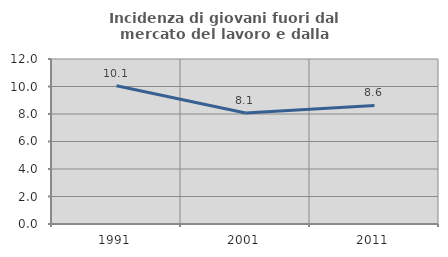
| Category | Incidenza di giovani fuori dal mercato del lavoro e dalla formazione  |
|---|---|
| 1991.0 | 10.056 |
| 2001.0 | 8.073 |
| 2011.0 | 8.627 |